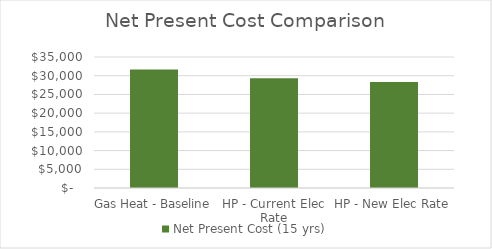
| Category | Net Present Cost (15 yrs) |
|---|---|
| Gas Heat - Baseline | 31640.383 |
| HP - Current Elec Rate | 29292.394 |
| HP - New Elec Rate | 28330.758 |